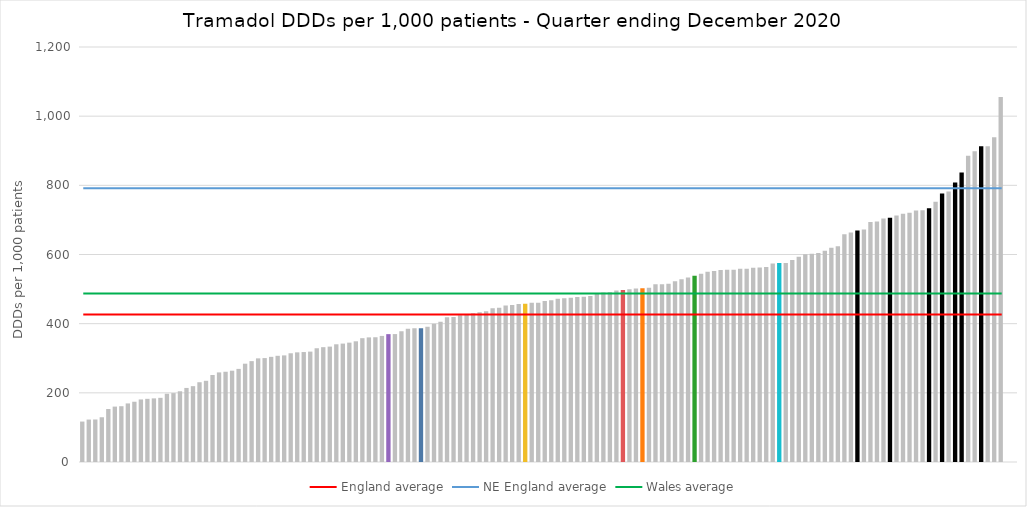
| Category | Series 0 |
|---|---|
| English CCGs | 116.915 |
| English CCGs | 122.684 |
| English CCGs | 122.952 |
| English CCGs | 129.38 |
| English CCGs | 153.206 |
| English CCGs | 160.193 |
| English CCGs | 161.305 |
| English CCGs | 169.372 |
| English CCGs | 174.256 |
| English CCGs | 180.88 |
| English CCGs | 182.678 |
| English CCGs | 183.961 |
| English CCGs | 185.542 |
| English CCGs | 197.35 |
| English CCGs | 199.196 |
| English CCGs | 204.54 |
| English CCGs | 214.148 |
| English CCGs | 219.286 |
| English CCGs | 230.642 |
| English CCGs | 234.787 |
| English CCGs | 251.639 |
| English CCGs | 259.042 |
| English CCGs | 260.954 |
| English CCGs | 264.029 |
| English CCGs | 269.235 |
| English CCGs | 284.291 |
| English CCGs | 291.67 |
| English CCGs | 299.696 |
| English CCGs | 300.508 |
| English CCGs | 304.048 |
| English CCGs | 307.094 |
| English CCGs | 308.251 |
| English CCGs | 314.421 |
| English CCGs | 317.064 |
| English CCGs | 317.916 |
| English CCGs | 319.194 |
| English CCGs | 328.915 |
| English CCGs | 332.05 |
| English CCGs | 333.64 |
| English CCGs | 340.374 |
| English CCGs | 342.386 |
| English CCGs | 345.15 |
| English CCGs | 348.996 |
| English CCGs | 358.029 |
| English CCGs | 360.337 |
| English CCGs | 360.723 |
| English CCGs | 364.542 |
| Powys  | 369.717 |
| English CCGs | 369.877 |
| English CCGs | 377.783 |
| English CCGs | 385.464 |
| English CCGs | 386.786 |
| Cardiff and Vale | 386.883 |
| English CCGs | 390.784 |
| English CCGs | 399.468 |
| English CCGs | 405.561 |
| English CCGs | 418.718 |
| English CCGs | 419.327 |
| English CCGs | 424.543 |
| English CCGs | 427.222 |
| English CCGs | 429.809 |
| English CCGs | 433.172 |
| English CCGs | 436.027 |
| English CCGs | 444.595 |
| English CCGs | 445.687 |
| English CCGs | 452.682 |
| English CCGs | 454.023 |
| English CCGs | 456.82 |
| Aneurin Bevan | 457.32 |
| English CCGs | 460.544 |
| English CCGs | 460.826 |
| English CCGs | 465.703 |
| English CCGs | 467.96 |
| English CCGs | 472.069 |
| English CCGs | 473.5 |
| English CCGs | 475.275 |
| English CCGs | 476.828 |
| English CCGs | 477.704 |
| English CCGs | 479.947 |
| English CCGs | 487.292 |
| English CCGs | 490.062 |
| English CCGs | 490.915 |
| English CCGs | 496.014 |
| Hywel Dda | 497.056 |
| English CCGs | 499.341 |
| English CCGs | 501.45 |
| Swansea Bay UHB | 502.518 |
| English CCGs | 503.704 |
| English CCGs | 513.726 |
| English CCGs | 514.286 |
| English CCGs | 515.25 |
| English CCGs | 522.471 |
| English CCGs | 528.793 |
| English CCGs | 533.547 |
| BCU | 538.284 |
| English CCGs | 544.218 |
| English CCGs | 549.966 |
| English CCGs | 552.363 |
| English CCGs | 554.98 |
| English CCGs | 555.92 |
| English CCGs | 556.005 |
| English CCGs | 558.545 |
| English CCGs | 559.095 |
| English CCGs | 561.384 |
| English CCGs | 562.184 |
| English CCGs | 564.147 |
| English CCGs | 573.71 |
| Cwm Taf Morgannwg UHB | 575.098 |
| English CCGs | 575.699 |
| English CCGs | 583.763 |
| English CCGs | 593.484 |
| English CCGs | 600.73 |
| English CCGs | 602.219 |
| English CCGs | 604.358 |
| English CCGs | 610.78 |
| English CCGs | 619.366 |
| English CCGs | 623.548 |
| English CCGs | 658.71 |
| English CCGs | 663.741 |
| NE England | 669.715 |
| English CCGs | 672.233 |
| English CCGs | 694.101 |
| English CCGs | 695.536 |
| English CCGs | 703.982 |
| NE England | 706.493 |
| English CCGs | 712.78 |
| English CCGs | 717.867 |
| English CCGs | 720.425 |
| English CCGs | 727.401 |
| English CCGs | 727.75 |
| NE England | 733.519 |
| English CCGs | 752.541 |
| NE England | 776.108 |
| English CCGs | 782.117 |
| NE England | 808.276 |
| NE England | 837.321 |
| English CCGs | 885.355 |
| English CCGs | 898.744 |
| NE England | 912.751 |
| English CCGs | 912.9 |
| English CCGs | 938.69 |
| English CCGs | 1055.205 |